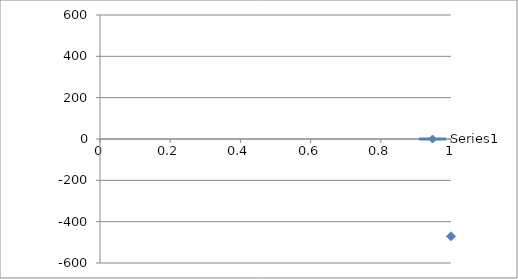
| Category | Series 0 |
|---|---|
| 0 | -470.66 |
| 1 | -355.72 |
| 2 | -332.41 |
| 3 | -238.79 |
| 4 | -121.35 |
| 5 | -2.82 |
| 6 | 115.59 |
| 7 | 234.25 |
| 8 | 329.01 |
| 9 | 352.75 |
| 10 | 471.14 |
| 11 | 356.24 |
| 12 | 332.99 |
| 13 | 239.43 |
| 14 | 121.74 |
| 15 | 3.52 |
| 16 | -115.12 |
| 17 | -233.56 |
| 18 | -328.41 |
| 19 | -352.27 |
| 20 | -470.57 |